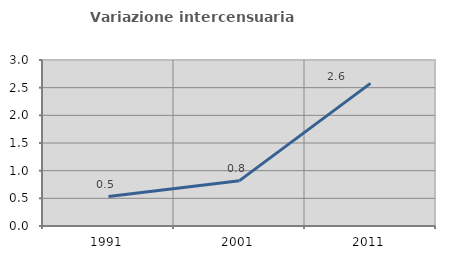
| Category | Variazione intercensuaria annua |
|---|---|
| 1991.0 | 0.533 |
| 2001.0 | 0.82 |
| 2011.0 | 2.577 |